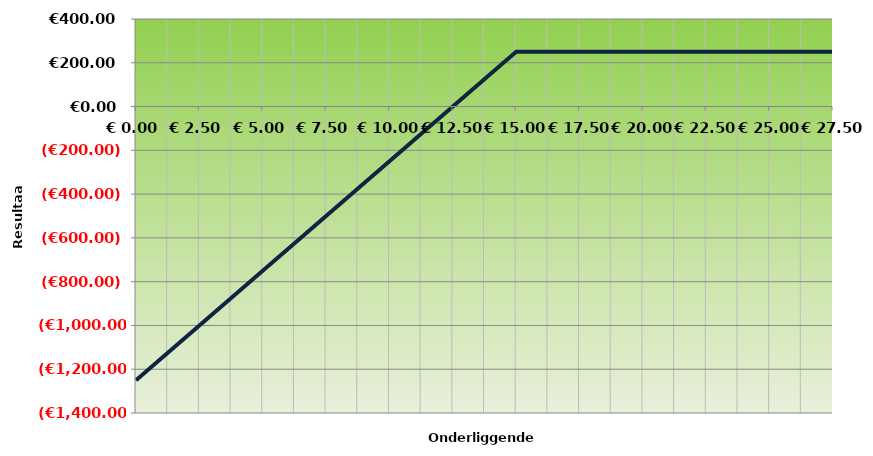
| Category | Series 0 |
|---|---|
| 0.0 | -1250 |
| 2.5 | -1000 |
| 5.0 | -750 |
| 7.5 | -500 |
| 10.0 | -250 |
| 12.5 | 0 |
| 15.0 | 250 |
| 17.5 | 250 |
| 20.0 | 250 |
| 22.5 | 250 |
| 25.0 | 250 |
| 27.5 | 250 |